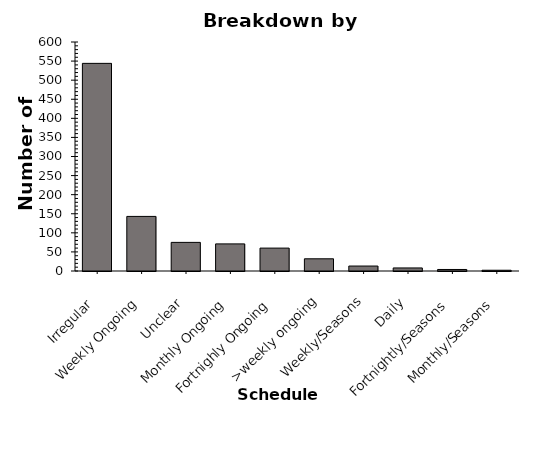
| Category | Series 0 |
|---|---|
| Irregular | 544 |
| Weekly Ongoing | 143 |
| Unclear | 75 |
| Monthly Ongoing | 71 |
| Fortnighly Ongoing | 60 |
| >weekly ongoing | 32 |
| Weekly/Seasons | 13 |
| Daily | 8 |
| Fortnightly/Seasons | 4 |
| Monthly/Seasons | 2 |